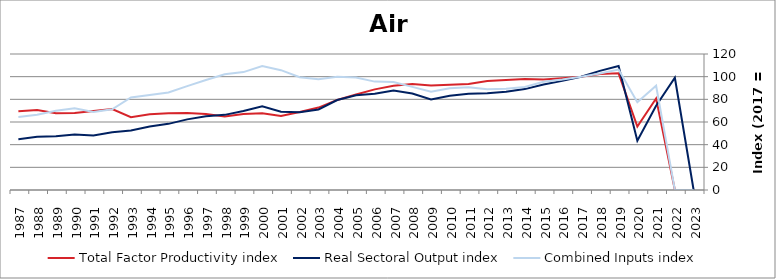
| Category | Total Factor Productivity index | Real Sectoral Output index | Combined Inputs index |
|---|---|---|---|
| 2023.0 | 0 | 0 | 0 |
| 2022.0 | 0 | 99.04 | 0 |
| 2021.0 | 80.773 | 74.298 | 91.984 |
| 2020.0 | 56.059 | 43.375 | 77.375 |
| 2019.0 | 102.925 | 109.382 | 106.273 |
| 2018.0 | 102.357 | 105.129 | 102.708 |
| 2017.0 | 100 | 100 | 100 |
| 2016.0 | 98.699 | 96.293 | 97.563 |
| 2015.0 | 97.478 | 93.139 | 95.549 |
| 2014.0 | 98.032 | 89.029 | 90.816 |
| 2013.0 | 96.999 | 86.65 | 89.331 |
| 2012.0 | 96.125 | 85.426 | 88.87 |
| 2011.0 | 93.619 | 84.851 | 90.634 |
| 2010.0 | 92.828 | 83.248 | 89.68 |
| 2009.0 | 92.122 | 79.847 | 86.676 |
| 2008.0 | 93.54 | 85.097 | 90.974 |
| 2007.0 | 92.054 | 87.698 | 95.269 |
| 2006.0 | 88.782 | 84.908 | 95.637 |
| 2005.0 | 84.302 | 83.636 | 99.21 |
| 2004.0 | 79.458 | 79.419 | 99.951 |
| 2003.0 | 72.727 | 71.015 | 97.646 |
| 2002.0 | 68.906 | 68.606 | 99.565 |
| 2001.0 | 65.38 | 69.138 | 105.748 |
| 2000.0 | 67.611 | 73.906 | 109.312 |
| 1999.0 | 67.009 | 69.704 | 104.021 |
| 1998.0 | 64.928 | 66.303 | 102.118 |
| 1997.0 | 66.989 | 65.025 | 97.069 |
| 1996.0 | 67.988 | 62.316 | 91.657 |
| 1995.0 | 67.779 | 58.356 | 86.098 |
| 1994.0 | 66.892 | 56.068 | 83.819 |
| 1993.0 | 64.308 | 52.543 | 81.705 |
| 1992.0 | 71.492 | 50.952 | 71.27 |
| 1991.0 | 69.642 | 48.008 | 68.936 |
| 1990.0 | 68.028 | 49.022 | 72.061 |
| 1989.0 | 67.806 | 47.437 | 69.961 |
| 1988.0 | 70.683 | 46.898 | 66.349 |
| 1987.0 | 69.53 | 44.855 | 64.511 |